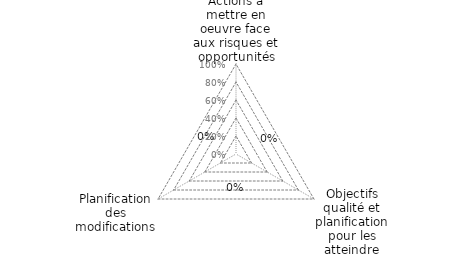
| Category | Art 6 |
|---|---|
| 0 | 0 |
| 1 | 0 |
| 2 | 0 |